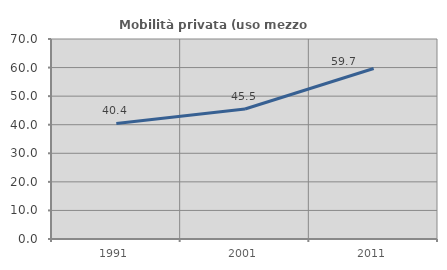
| Category | Mobilità privata (uso mezzo privato) |
|---|---|
| 1991.0 | 40.441 |
| 2001.0 | 45.491 |
| 2011.0 | 59.684 |